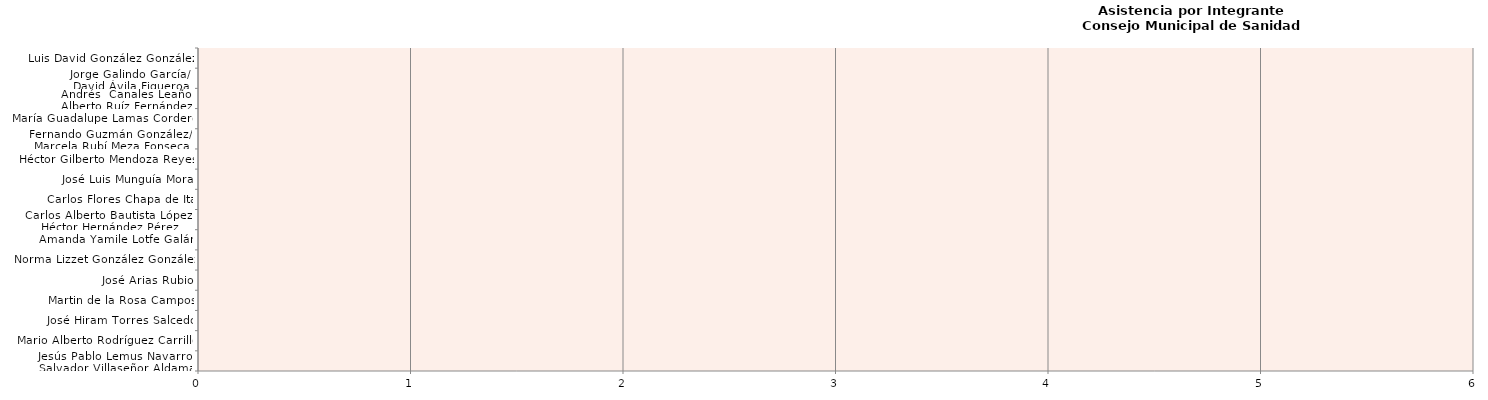
| Category | Series 0 |
|---|---|
| Jesús Pablo Lemus Navarro/
Salvador Villaseñor Aldama | 0 |
| Mario Alberto Rodríguez Carrillo | 0 |
| José Hiram Torres Salcedo | 0 |
| Martin de la Rosa Campos | 0 |
| José Arias Rubio | 0 |
| Norma Lizzet González González | 0 |
| Amanda Yamile Lotfe Galán | 0 |
| Carlos Alberto Bautista López/
Héctor Hernández Pérez | 0 |
| Carlos Flores Chapa de Ita | 0 |
| José Luis Munguía Mora | 0 |
| Héctor Gilberto Mendoza Reyes | 0 |
| Fernando Guzmán González/ 
Marcela Rubí Meza Fonseca | 0 |
| María Guadalupe Lamas Cordero | 0 |
| Andrés  Canales Leaño/
Alberto Ruíz Fernández | 0 |
| Jorge Galindo García/ 
David Ávila Figueroa | 0 |
| Luis David González González | 0 |